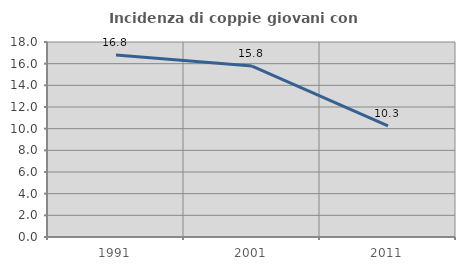
| Category | Incidenza di coppie giovani con figli |
|---|---|
| 1991.0 | 16.806 |
| 2001.0 | 15.781 |
| 2011.0 | 10.256 |